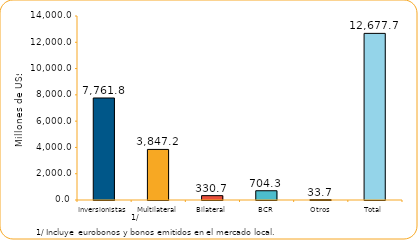
| Category | Series 1 |
|---|---|
| Inversionistas | 7761.8 |
| Multilateral | 3847.2 |
| Bilateral | 330.7 |
| BCR | 704.3 |
| Otros | 33.7 |
| Total | 12677.7 |